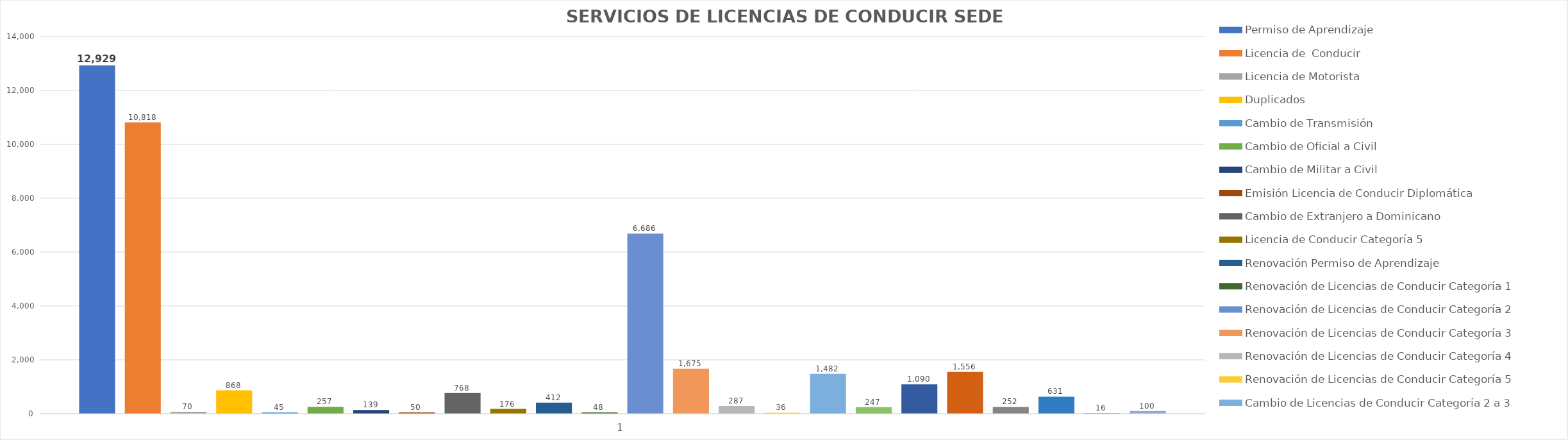
| Category | Permiso de Aprendizaje  | Licencia de  Conducir  | Licencia de Motorista | Duplicados  | Cambio de Transmisión  | Cambio de Oficial a Civil | Cambio de Militar a Civil | Emisión Licencia de Conducir Diplomática | Cambio de Extranjero a Dominicano | Licencia de Conducir Categoría 5 | Renovación Permiso de Aprendizaje | Renovación de Licencias de Conducir Categoría 1 | Renovación de Licencias de Conducir Categoría 2 | Renovación de Licencias de Conducir Categoría 3 | Renovación de Licencias de Conducir Categoría 4 | Renovación de Licencias de Conducir Categoría 5 | Cambio de Licencias de Conducir Categoría 2 a 3  | Cambio de Licencias de Conducir Categoría 3 a 4 | Re-Examen Teórico | Re-Examen Práctico | Licencia de  Conducir para Policia  | Renovación para Policia | Duplicados para Policia | Cambio de Categoría para Policia |
|---|---|---|---|---|---|---|---|---|---|---|---|---|---|---|---|---|---|---|---|---|---|---|---|---|
| 0 | 12929 | 10818 | 70 | 868 | 45 | 257 | 139 | 50 | 768 | 176 | 412 | 48 | 6686 | 1675 | 287 | 36 | 1482 | 247 | 1090 | 1556 | 252 | 631 | 16 | 100 |